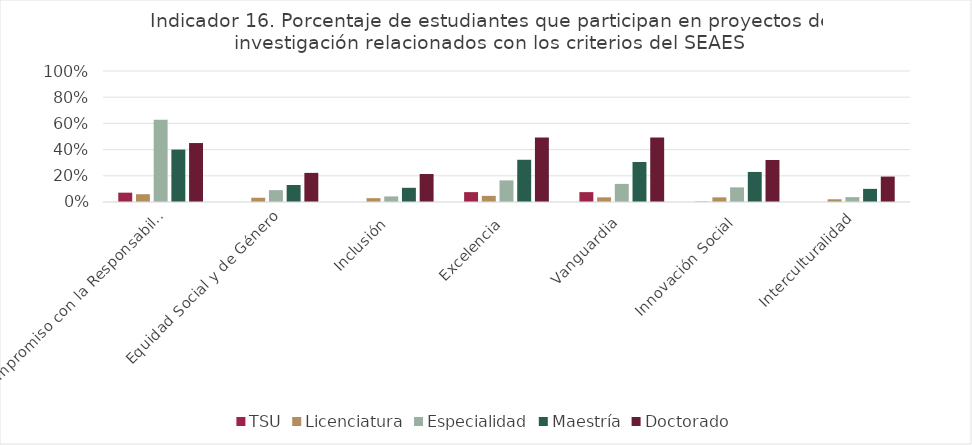
| Category | TSU | Licenciatura | Especialidad | Maestría | Doctorado |
|---|---|---|---|---|---|
| Compromiso con la Responsabilidad Social | 0.071 | 0.059 | 0.628 | 0.4 | 0.45 |
| Equidad Social y de Género | 0 | 0.032 | 0.09 | 0.13 | 0.222 |
| Inclusión | 0 | 0.029 | 0.043 | 0.108 | 0.214 |
| Excelencia | 0.075 | 0.047 | 0.165 | 0.322 | 0.492 |
| Vanguardia | 0.075 | 0.036 | 0.138 | 0.306 | 0.492 |
| Innovación Social | 0.002 | 0.035 | 0.112 | 0.229 | 0.321 |
| Interculturalidad | 0 | 0.021 | 0.037 | 0.1 | 0.194 |